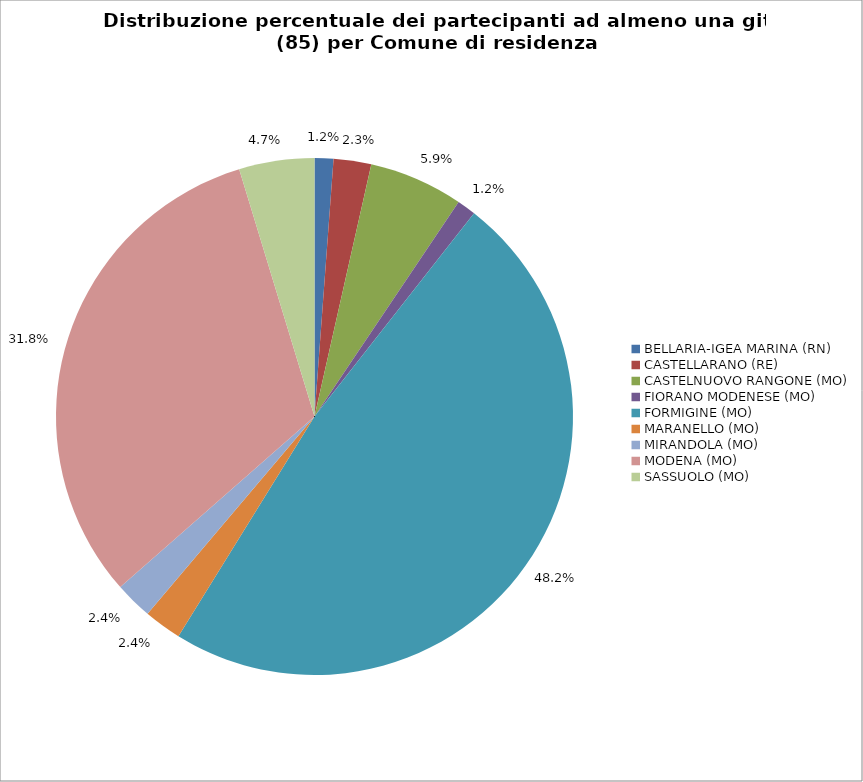
| Category | Nr. Tesserati |
|---|---|
| BELLARIA-IGEA MARINA (RN) | 1 |
| CASTELLARANO (RE) | 2 |
| CASTELNUOVO RANGONE (MO) | 5 |
| FIORANO MODENESE (MO) | 1 |
| FORMIGINE (MO) | 41 |
| MARANELLO (MO) | 2 |
| MIRANDOLA (MO) | 2 |
| MODENA (MO) | 27 |
| SASSUOLO (MO) | 4 |